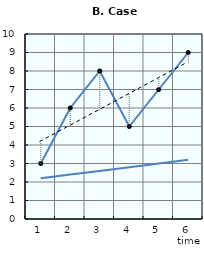
| Category | income trajectory | individual trend |
|---|---|---|
| 1.0 | 3 | 4.19 |
| 2.0 | 6 | 5.047 |
| 3.0 | 8 | 5.904 |
| 4.0 | 5 | 6.761 |
| 5.0 | 7 | 7.618 |
| 6.0 | 9 | 8.475 |